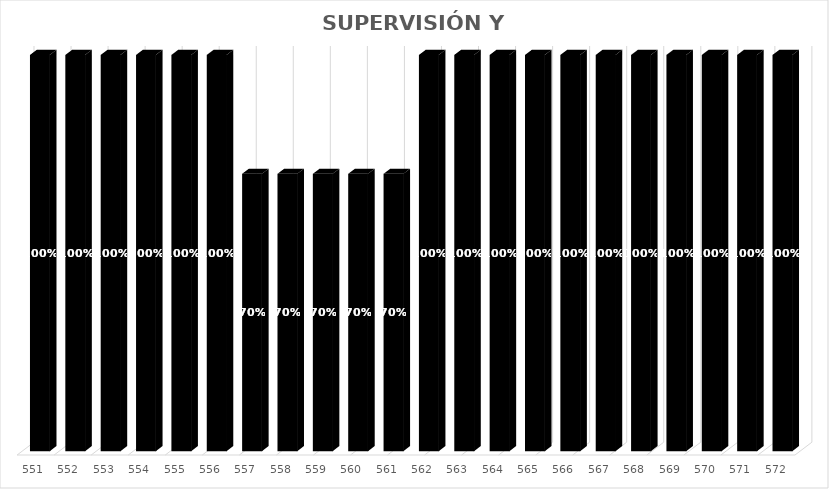
| Category | % Avance |
|---|---|
| 551.0 | 1 |
| 552.0 | 1 |
| 553.0 | 1 |
| 554.0 | 1 |
| 555.0 | 1 |
| 556.0 | 1 |
| 557.0 | 0.7 |
| 558.0 | 0.7 |
| 559.0 | 0.7 |
| 560.0 | 0.7 |
| 561.0 | 0.7 |
| 562.0 | 1 |
| 563.0 | 1 |
| 564.0 | 1 |
| 565.0 | 1 |
| 566.0 | 1 |
| 567.0 | 1 |
| 568.0 | 1 |
| 569.0 | 1 |
| 570.0 | 1 |
| 571.0 | 1 |
| 572.0 | 1 |